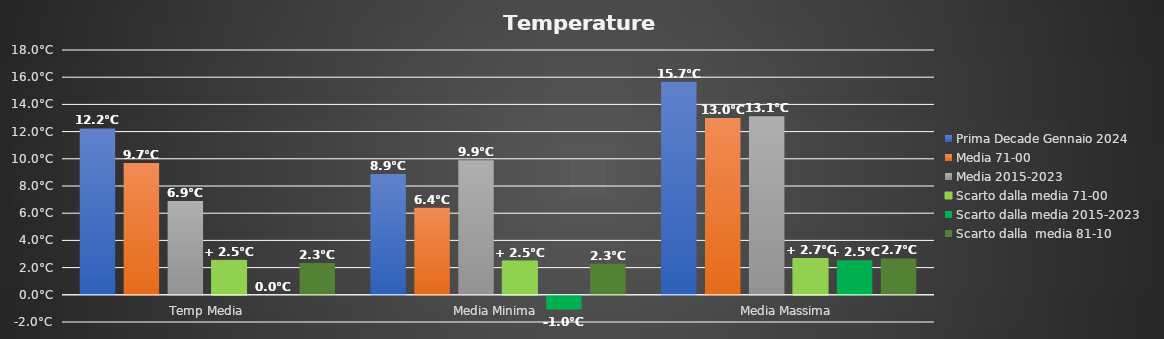
| Category | Prima Decade Gennaio 2024 | Media 71-00 | Media 2015-2023 | Scarto dalla media 71-00 | Scarto dalla media 2015-2023 | Scarto dalla  media 81-10 |
|---|---|---|---|---|---|---|
| Temp Media | 12.233 | 9.7 | 6.9 | 2.533 | 0 | 2.333 |
| Media Minima  | 8.89 | 6.4 | 9.9 | 2.49 | -1.01 | 2.29 |
| Media Massima | 15.67 | 13 | 13.136 | 2.67 | 2.534 | 2.67 |